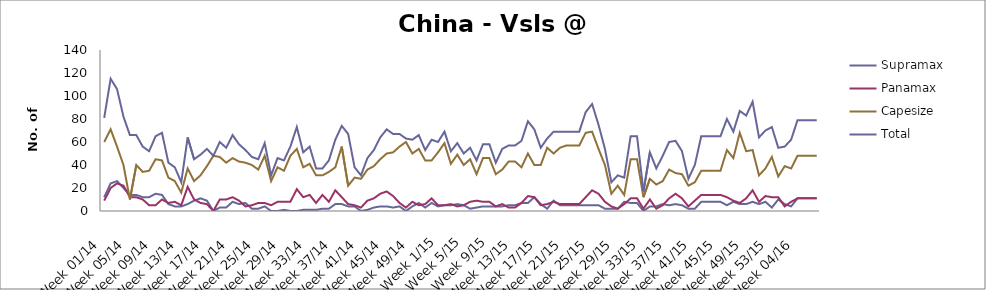
| Category | Supramax | Panamax | Capesize | Total |
|---|---|---|---|---|
| Week 01/14 | 12 | 9 | 60 | 81 |
| Week 02/14 | 24 | 20 | 71 | 115 |
| Week 03/14 | 26 | 24 | 56 | 106 |
| Week 04/14 | 20 | 22 | 40 | 82 |
| Week 05/14 | 14 | 12 | 10 | 66 |
| Week 06/14 | 14 | 12 | 40 | 66 |
| Week 07/14 | 12 | 10 | 34 | 56 |
| Week 08/14 | 12 | 5 | 35 | 52 |
| Week 09/14 | 15 | 5 | 45 | 65 |
| Week 10/14 | 14 | 10 | 44 | 68 |
| Week 11/14 | 6 | 7 | 29 | 42 |
| Week 12/14 | 4 | 8 | 26 | 38 |
| Week 13/14 | 4 | 5 | 16 | 25 |
| Week 14/14 | 6 | 21 | 37 | 64 |
| Week 15/14 | 9 | 10 | 26 | 45 |
| Week 16/14 | 11 | 7 | 31 | 49 |
| Week 17/14 | 9 | 6 | 39 | 54 |
| Week 18/14 | 0 | 0 | 48 | 48 |
| Week 19/14 | 3 | 10 | 47 | 60 |
| Week 20/14 | 3 | 10 | 42 | 55 |
| Week 21/14 | 8 | 12 | 46 | 66 |
| Week 22/14 | 6 | 9 | 43 | 58 |
| Week 23/14 | 7 | 4 | 42 | 53 |
| Week 24/14 | 2 | 5 | 40 | 47 |
| Week 25/14 | 2 | 7 | 36 | 45 |
| Week 26/14 | 4 | 7 | 48 | 59 |
| Week 27/14 | 0 | 5 | 26 | 31 |
| Week 28/14 | 0 | 8 | 38 | 46 |
| Week 29/14 | 1 | 8 | 35 | 44 |
| Week 30/14 | 0 | 8 | 48 | 56 |
| Week 31/14 | 0 | 19 | 54 | 73 |
| Week 32/14 | 1 | 12 | 38 | 51 |
| Week 33/14 | 1 | 14 | 41 | 56 |
| Week 34/14 | 1 | 7 | 31 | 37 |
| Week 35/14 | 2 | 14 | 31 | 37 |
| Week 36/14 | 2 | 8 | 34 | 44 |
| Week 37/14 | 6 | 18 | 38 | 62 |
| Week 38/14 | 6 | 12 | 56 | 74 |
| Week 39/14 | 4 | 6 | 22 | 67 |
| Week 40/14 | 4 | 5 | 29 | 38 |
| Week 41/14 | 0 | 3 | 28 | 31 |
| Week 42/14 | 1 | 9 | 36 | 46 |
| Week 43/14 | 3 | 11 | 39 | 53 |
| Week 44/14 | 4 | 15 | 45 | 64 |
| Week 45/14 | 4 | 17 | 50 | 71 |
| Week 46/14 | 3 | 13 | 51 | 67 |
| Week 47/14 | 4 | 7 | 56 | 67 |
| Week 48/14 | 0 | 3 | 60 | 63 |
| Week 49/14 | 4 | 8 | 50 | 62 |
| Week 50/14 | 7 | 5 | 54 | 66 |
| Week 51/14 | 3 | 6 | 44 | 53 |
| Week 52/14 | 7 | 11 | 44 | 62 |
| Week 1/15 | 4 | 5 | 51 | 60 |
| Week 2/15 | 5 | 5 | 59 | 69 |
| Week 3/15 | 5 | 6 | 41 | 52 |
| Week 4/15 | 6 | 4 | 49 | 59 |
| Week 5/15 | 5 | 5 | 40 | 50 |
| Week 6/15 | 2 | 8 | 45 | 55 |
| Week 7/15 | 3 | 9 | 32 | 44 |
| Week 8/15 | 4 | 8 | 46 | 58 |
| Week 9/15 | 4 | 8 | 46 | 58 |
| Week 10/15 | 4 | 4 | 32 | 42 |
| Week 11/15 | 4 | 6 | 36 | 54 |
| Week 12/15 | 5 | 3 | 43 | 57 |
| Week 13/15 | 5 | 3 | 43 | 57 |
| Week 14/15 | 7 | 7 | 38 | 61 |
| Week 15/15 | 7 | 13 | 50 | 78 |
| Week 16/15 | 12 | 12 | 40 | 71 |
| Week 17/15 | 6 | 5 | 40 | 55 |
| Week 18/15 | 2 | 6 | 55 | 63 |
| Week 19/15 | 9 | 8 | 50 | 69 |
| Week 20/15 | 5 | 6 | 55 | 69 |
| Week 21/15 | 5 | 6 | 57 | 69 |
| Week 22/15 | 5 | 6 | 57 | 69 |
| Week 23/15 | 5 | 6 | 57 | 69 |
| Week 24/15 | 5 | 12 | 68 | 86 |
| Week 25/15 | 5 | 18 | 69 | 93 |
| Week 26/15 | 5 | 15 | 54 | 75 |
| Week 27/15 | 2 | 8 | 40 | 54 |
| Week 28/15 | 2 | 4 | 15 | 25 |
| Week 29/15 | 2 | 2 | 22 | 31 |
| Week 30/15 | 8 | 6 | 14 | 29 |
| Week 31/15 | 7 | 11 | 45 | 65 |
| Week 32/15 | 7 | 11 | 45 | 65 |
| Week 33/15 | 0 | 2 | 12 | 17 |
| Week 34/15 | 4 | 10 | 28 | 51 |
| Week 35/15 | 4 | 2 | 23 | 37 |
| Week 36/15 | 6 | 5 | 26 | 48 |
| Week 37/15 | 5 | 11 | 36 | 60 |
| Week 38/15 | 6 | 15 | 33 | 61 |
| Week 39/15 | 5 | 11 | 32 | 52 |
| Week 40/15 | 2 | 4 | 22 | 28 |
| Week 41/15 | 2 | 9 | 25 | 40 |
| Week 42/15 | 8 | 14 | 35 | 65 |
| Week 43/15 | 8 | 14 | 35 | 65 |
| Week 44/15 | 8 | 14 | 35 | 65 |
| Week 45/15 | 8 | 14 | 35 | 65 |
| Week 46/15 | 5 | 12 | 53 | 80 |
| Week 47/15 | 8 | 9 | 46 | 69 |
| Week 48/15 | 6 | 7 | 68 | 87 |
| Week 49/15 | 6 | 11 | 52 | 83 |
| Week 50/15 | 8 | 18 | 53 | 95 |
| Week 51/15 | 6 | 8 | 31 | 64 |
| Week 52/15 | 8 | 13 | 37 | 70 |
| Week 53/15 | 3 | 12 | 47 | 73 |
| Week 01/16 | 10 | 12 | 30 | 55 |
| Week 02/16 | 6 | 4 | 39 | 56 |
| Week 03/16 | 4 | 8 | 37 | 62 |
| Week 04/16 | 11 | 11 | 48 | 79 |
| Week 05/16 | 11 | 11 | 48 | 79 |
| Week 06/16 | 11 | 11 | 48 | 79 |
| Week 07/16 | 11 | 11 | 48 | 79 |